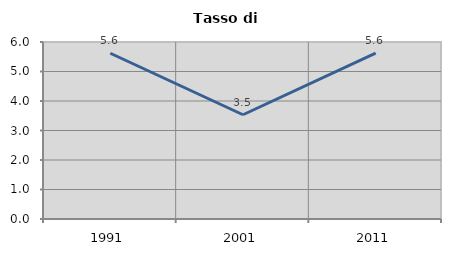
| Category | Tasso di disoccupazione   |
|---|---|
| 1991.0 | 5.619 |
| 2001.0 | 3.534 |
| 2011.0 | 5.624 |